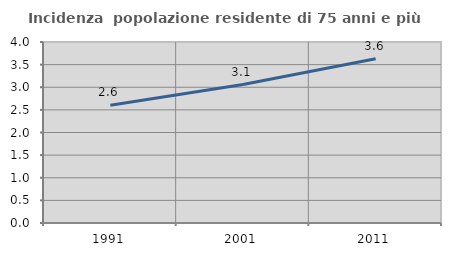
| Category | Incidenza  popolazione residente di 75 anni e più |
|---|---|
| 1991.0 | 2.603 |
| 2001.0 | 3.059 |
| 2011.0 | 3.628 |